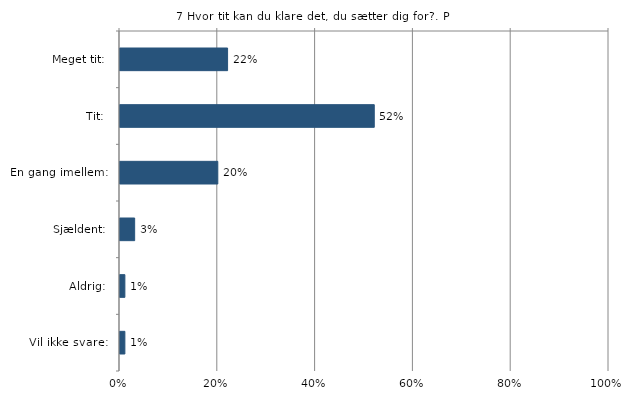
| Category | Hvor tit kan du klare det, du sætter dig for? |
|---|---|
| Meget tit:  | 0.22 |
| Tit:  | 0.52 |
| En gang imellem:  | 0.2 |
| Sjældent:  | 0.03 |
| Aldrig:  | 0.01 |
| Vil ikke svare:  | 0.01 |